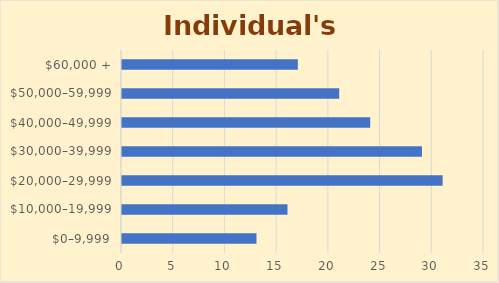
| Category | Series 0 |
|---|---|
| $0–9,999 | 13 |
| $10,000–19,999 | 16 |
| $20,000–29,999 | 31 |
| $30,000–39,999 | 29 |
| $40,000–49,999 | 24 |
| $50,000–59,999 | 21 |
| $60,000 + | 17 |